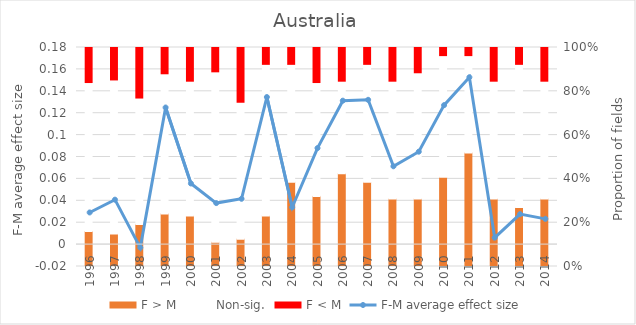
| Category | F > M | Non-sig. | F < M |
|---|---|---|---|
| 0 | 4 | 17 | 4 |
| 1 | 4 | 19 | 4 |
| 2 | 5 | 15 | 6 |
| 3 | 6 | 16 | 3 |
| 4 | 6 | 16 | 4 |
| 5 | 3 | 21 | 3 |
| 6 | 3 | 15 | 6 |
| 7 | 6 | 18 | 2 |
| 8 | 10 | 14 | 2 |
| 9 | 8 | 13 | 4 |
| 10 | 11 | 11 | 4 |
| 11 | 10 | 14 | 2 |
| 12 | 8 | 14 | 4 |
| 13 | 8 | 15 | 3 |
| 14 | 11 | 15 | 1 |
| 15 | 14 | 12 | 1 |
| 16 | 8 | 14 | 4 |
| 17 | 7 | 17 | 2 |
| 18 | 8 | 14 | 4 |